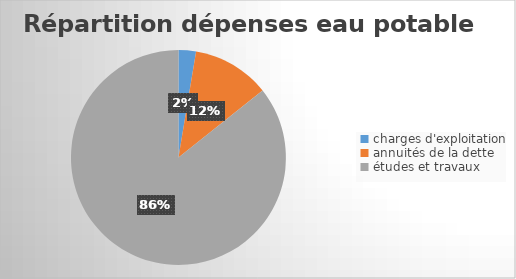
| Category | Series 0 |
|---|---|
| charges d'exploitation | 138500 |
| annuités de la dette | 617000 |
| études et travaux | 4530800 |